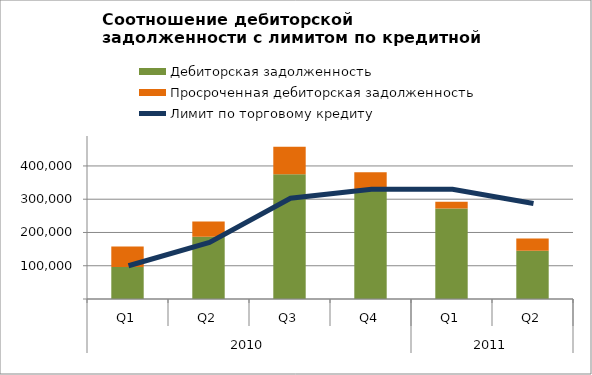
| Category | Дебиторская задолженность | Просроченная дебиторская задолженность |
|---|---|---|
| 0 | 96000 | 62000 |
| 1 | 187000 | 46000 |
| 2 | 375000 | 83000 |
| 3 | 331000 | 50000 |
| 4 | 272000 | 20000 |
| 5 | 145000 | 37000 |